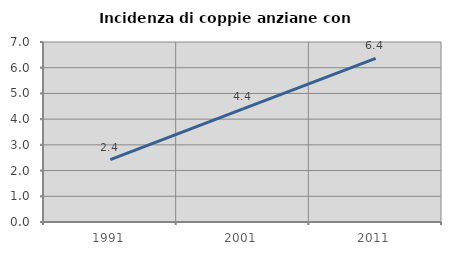
| Category | Incidenza di coppie anziane con figli |
|---|---|
| 1991.0 | 2.424 |
| 2001.0 | 4.396 |
| 2011.0 | 6.364 |